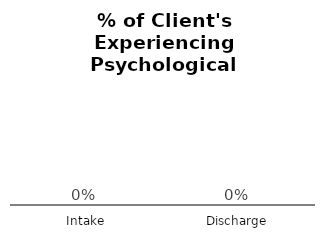
| Category | Series 0 |
|---|---|
| Intake | 0 |
| Discharge | 0 |